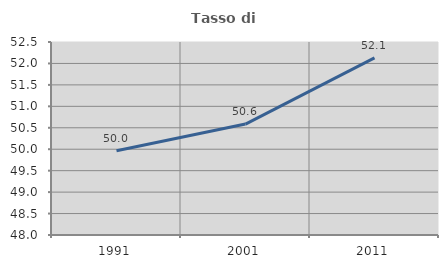
| Category | Tasso di occupazione   |
|---|---|
| 1991.0 | 49.962 |
| 2001.0 | 50.587 |
| 2011.0 | 52.129 |